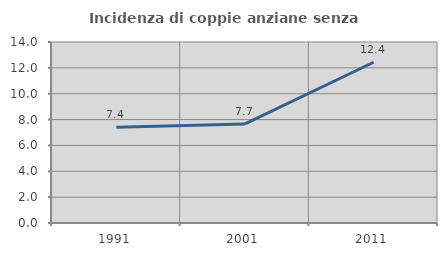
| Category | Incidenza di coppie anziane senza figli  |
|---|---|
| 1991.0 | 7.397 |
| 2001.0 | 7.665 |
| 2011.0 | 12.435 |